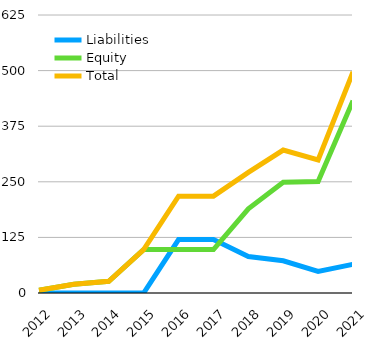
| Category | Liabilities  | Equity  | Total |
|---|---|---|---|
| 2012 | 0 | 6.202 | 6.202 |
| 2013 | 0 | 19.749 | 19.749 |
| 2014 | 0 | 26.451 | 26.451 |
| 2015 | 0 | 97.584 | 97.584 |
| 2016 | 120.07 | 97.584 | 217.654 |
| 2017 | 120.192 | 97.584 | 217.776 |
| 2018 | 81.903 | 189.265 | 271.168 |
| 2019 | 72.403 | 248.992 | 321.395 |
| 2020 | 48.628 | 250.657 | 299.285 |
| 2021 | 64.67 | 432.299 | 496.969 |